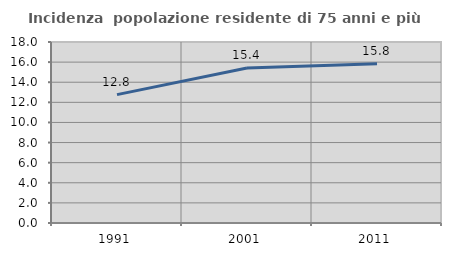
| Category | Incidenza  popolazione residente di 75 anni e più |
|---|---|
| 1991.0 | 12.766 |
| 2001.0 | 15.419 |
| 2011.0 | 15.826 |